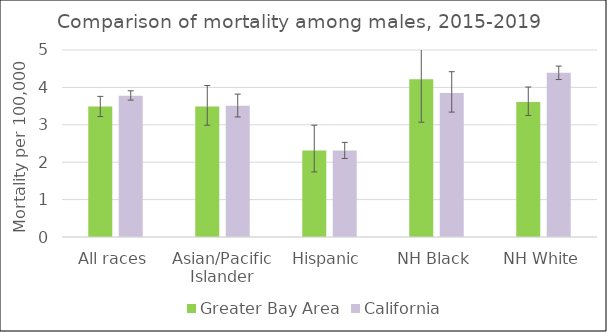
| Category | Greater Bay Area | California | US Mortality |
|---|---|---|---|
| All races | 3.49 | 3.78 |  |
| Asian/Pacific Islander | 3.49 | 3.51 |  |
| Hispanic | 2.31 | 2.31 |  |
| NH Black | 4.22 | 3.85 |  |
| NH White | 3.61 | 4.39 |  |